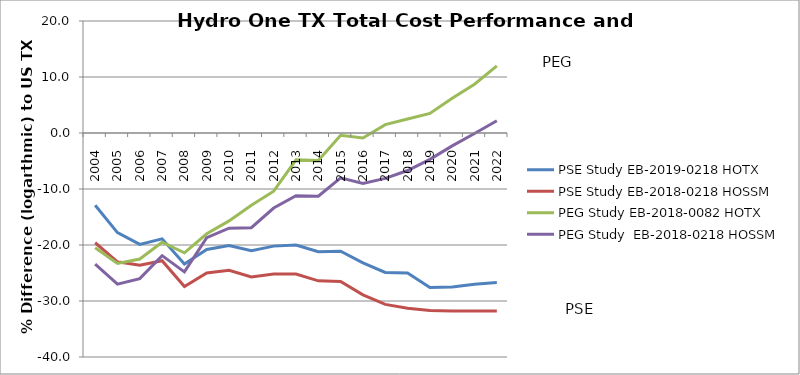
| Category | PSE Study EB-2019-0218 HOTX | PSE Study EB-2018-0218 HOSSM | PEG Study EB-2018-0082 HOTX | PEG Study  EB-2018-0218 HOSSM |
|---|---|---|---|---|
| 2004.0 | -12.9 | -19.6 | -20.5 | -23.4 |
| 2005.0 | -17.8 | -23 | -23.3 | -27 |
| 2006.0 | -19.9 | -23.6 | -22.5 | -26 |
| 2007.0 | -18.9 | -22.8 | -19.5 | -21.9 |
| 2008.0 | -23.4 | -27.4 | -21.4 | -24.8 |
| 2009.0 | -20.8 | -25 | -18 | -18.7 |
| 2010.0 | -20.1 | -24.5 | -15.7 | -17 |
| 2011.0 | -21 | -25.7 | -12.9 | -16.9 |
| 2012.0 | -20.2 | -25.2 | -10.4 | -13.4 |
| 2013.0 | -20 | -25.2 | -4.8 | -11.2 |
| 2014.0 | -21.2 | -26.4 | -4.9 | -11.3 |
| 2015.0 | -21.1 | -26.5 | -0.4 | -8 |
| 2016.0 | -23.2 | -28.9 | -0.9 | -9 |
| 2017.0 | -24.9 | -30.6 | 1.5 | -8.1 |
| 2018.0 | -25 | -31.3 | 2.5 | -6.7 |
| 2019.0 | -27.6 | -31.7 | 3.5 | -4.7 |
| 2020.0 | -27.5 | -31.8 | 6.2 | -2.3 |
| 2021.0 | -27 | -31.8 | 8.7 | -0.1 |
| 2022.0 | -26.7 | -31.8 | 12 | 2.2 |